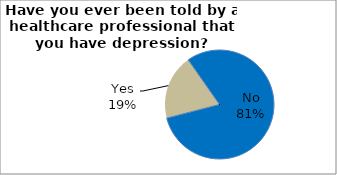
| Category | Series 0 |
|---|---|
| No | 80.699 |
| Yes | 19.301 |